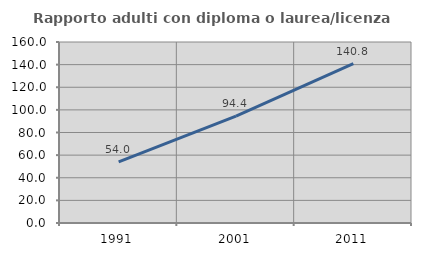
| Category | Rapporto adulti con diploma o laurea/licenza media  |
|---|---|
| 1991.0 | 53.978 |
| 2001.0 | 94.428 |
| 2011.0 | 140.8 |